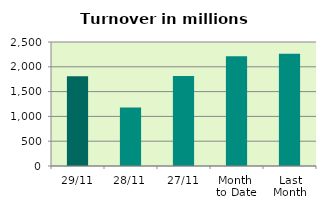
| Category | Series 0 |
|---|---|
| 29/11 | 1809.007 |
| 28/11 | 1177.07 |
| 27/11 | 1812.374 |
| Month 
to Date | 2210.602 |
| Last
Month | 2263.558 |